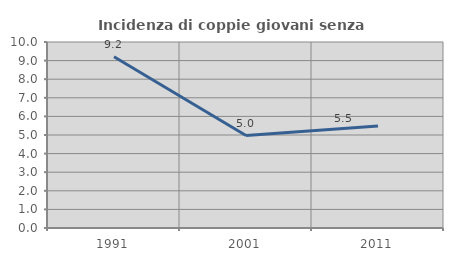
| Category | Incidenza di coppie giovani senza figli |
|---|---|
| 1991.0 | 9.202 |
| 2001.0 | 4.969 |
| 2011.0 | 5.488 |